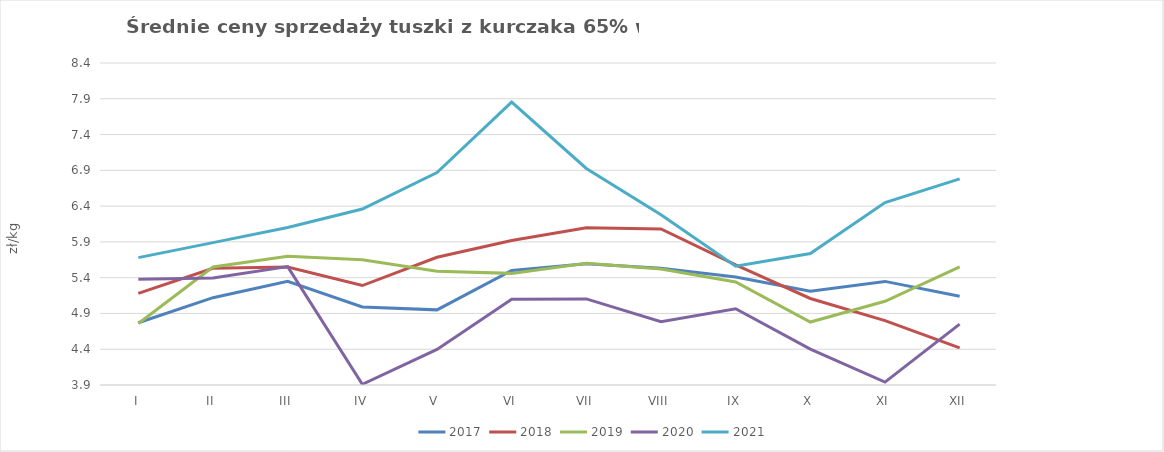
| Category | 2017 | 2018 | 2019 | 2020 | 2021 |
|---|---|---|---|---|---|
| I | 4.77 | 5.18 | 4.76 | 5.379 | 5.68 |
| II | 5.12 | 5.53 | 5.55 | 5.395 | 5.89 |
| III | 5.35 | 5.55 | 5.7 | 5.555 | 6.1 |
| IV | 4.99 | 5.29 | 5.65 | 3.91 | 6.36 |
| V | 4.95 | 5.685 | 5.49 | 4.397 | 6.87 |
| VI | 5.5 | 5.92 | 5.46 | 5.1 | 7.853 |
| VII | 5.595 | 6.099 | 5.6 | 5.103 | 6.926 |
| VIII | 5.53 | 6.08 | 5.52 | 4.784 | 6.28 |
| IX | 5.41 | 5.58 | 5.34 | 4.965 | 5.56 |
| X | 5.21 | 5.109 | 4.78 | 4.402 | 5.738 |
| XI | 5.348 | 4.8 | 5.07 | 3.94 | 6.45 |
| XII | 5.14 | 4.42 | 5.55 | 4.75 | 6.78 |